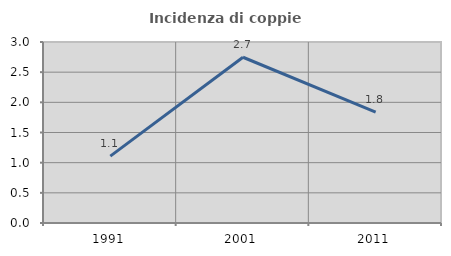
| Category | Incidenza di coppie miste |
|---|---|
| 1991.0 | 1.108 |
| 2001.0 | 2.747 |
| 2011.0 | 1.837 |